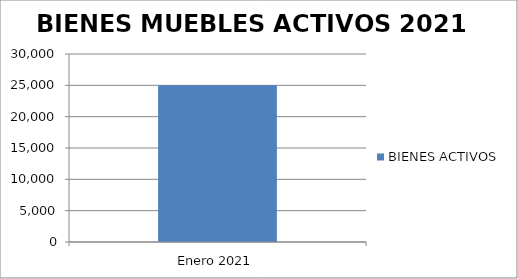
| Category | BIENES ACTIVOS |
|---|---|
| Enero 2021 | 25005 |